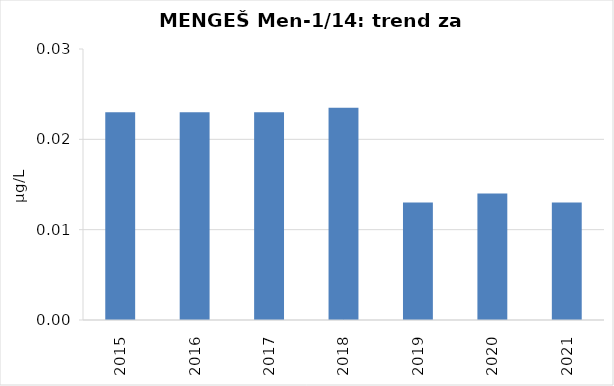
| Category | Vsota |
|---|---|
| 2015 | 0.023 |
| 2016 | 0.023 |
| 2017 | 0.023 |
| 2018 | 0.024 |
| 2019 | 0.013 |
| 2020 | 0.014 |
| 2021 | 0.013 |